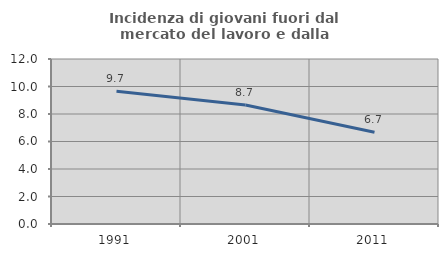
| Category | Incidenza di giovani fuori dal mercato del lavoro e dalla formazione  |
|---|---|
| 1991.0 | 9.662 |
| 2001.0 | 8.659 |
| 2011.0 | 6.667 |